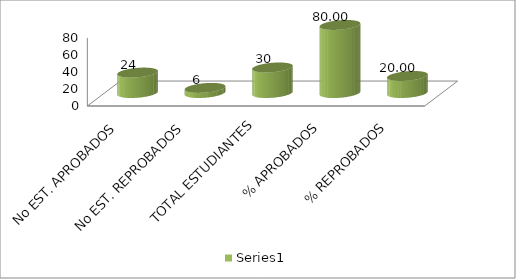
| Category | Series 0 |
|---|---|
| No EST. APROBADOS | 24 |
| No EST. REPROBADOS | 6 |
| TOTAL ESTUDIANTES | 30 |
| % APROBADOS | 80 |
| % REPROBADOS | 20 |